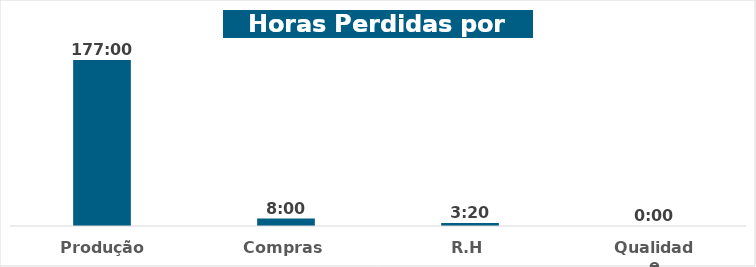
| Category | Total |
|---|---|
| Produção | 1900-01-07 09:00:00 |
| Compras | 0.333 |
| R.H | 0.139 |
| Qualidade | 0 |